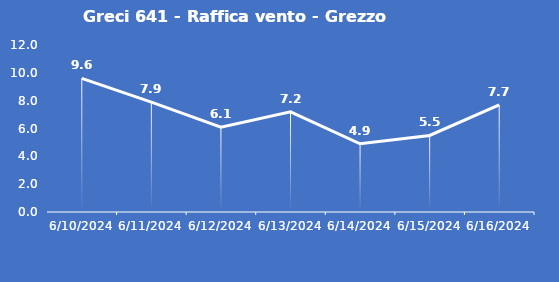
| Category | Greci 641 - Raffica vento - Grezzo (m/s) |
|---|---|
| 6/10/24 | 9.6 |
| 6/11/24 | 7.9 |
| 6/12/24 | 6.1 |
| 6/13/24 | 7.2 |
| 6/14/24 | 4.9 |
| 6/15/24 | 5.5 |
| 6/16/24 | 7.7 |